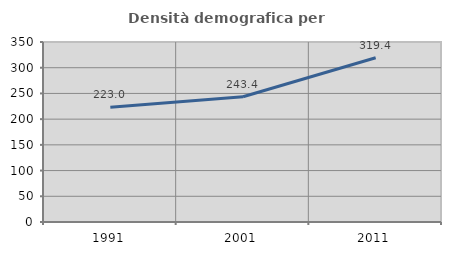
| Category | Densità demografica |
|---|---|
| 1991.0 | 222.985 |
| 2001.0 | 243.444 |
| 2011.0 | 319.417 |